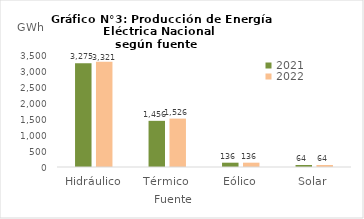
| Category | 2021 | 2022 |
|---|---|---|
| Hidráulico | 3275.229 | 3320.941 |
| Térmico | 1455.573 | 1526.16 |
| Eólico | 135.947 | 136.396 |
| Solar | 63.765 | 63.608 |